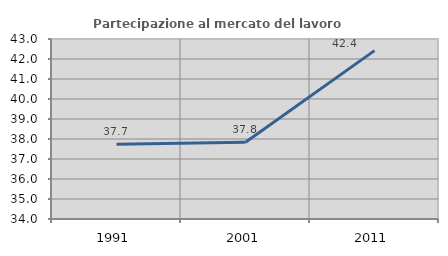
| Category | Partecipazione al mercato del lavoro  femminile |
|---|---|
| 1991.0 | 37.733 |
| 2001.0 | 37.833 |
| 2011.0 | 42.42 |